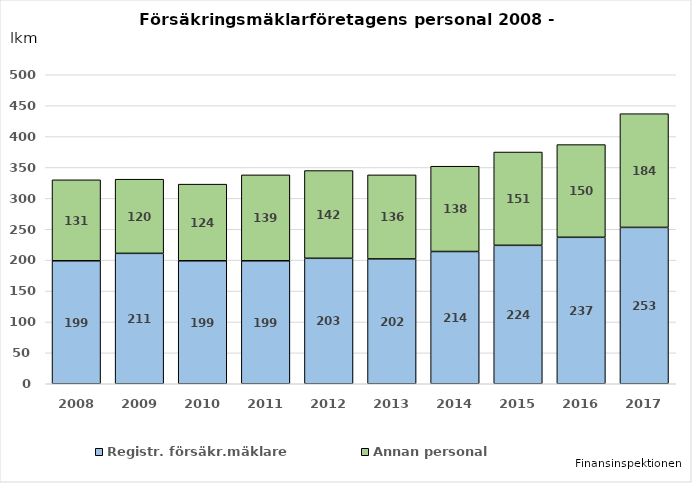
| Category | Registr. försäkr.mäklare | Annan personal |
|---|---|---|
| 2008.0 | 199 | 131 |
| 2009.0 | 211 | 120 |
| 2010.0 | 199 | 124 |
| 2011.0 | 199 | 139 |
| 2012.0 | 203 | 142 |
| 2013.0 | 202 | 136 |
| 2014.0 | 214 | 138 |
| 2015.0 | 224 | 151 |
| 2016.0 | 237 | 150 |
| 2017.0 | 253 | 184 |